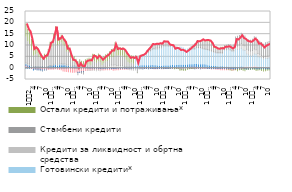
| Category | Минуси по трансакционим рачунима | Потрошачки кредити | Инвестициони кредити | Готовински кредити*  | Кредити за ликвидност и обртна средства | Стамбени кредити  | Oстали кредити и потраживања* |
|---|---|---|---|---|---|---|---|
| 1
2011. | 0.412 | 0.655 | 0.647 | 0 | 0.695 | 11.187 | 5.89 |
| 2 | 0.452 | 0.34 | 0.515 | 0 | 0.611 | 9.773 | 5.375 |
| 3 | 0.541 | 0.023 | 0.639 | 0 | 0.618 | 8.603 | 5.509 |
| 4 | 0.399 | -0.076 | 0.357 | 0 | 0.365 | 6.691 | 4.853 |
| 5 | 0.675 | -0.469 | -0.321 | 0 | 0.052 | 4.576 | 3.732 |
| 6 | 0.609 | -0.379 | -0.058 | 0 | -0.006 | 5.227 | 3.576 |
| 7 | 0.541 | -0.514 | -0.134 | 0 | -0.154 | 5.662 | 2.763 |
| 8 | 0.556 | -0.509 | -0.208 | 0 | -0.201 | 4.307 | 2.537 |
| 9 | 0.546 | -0.636 | -0.314 | 0 | -0.156 | 3.469 | 2.081 |
| 10 | 0.684 | -0.802 | -0.386 | 0 | -0.169 | 3.05 | 1.577 |
| 11 | 0.529 | -0.704 | -0.115 | 0 | -0.125 | 3.653 | 1.909 |
| 12 | 0.401 | -0.688 | -0.061 | 0 | -0.026 | 3.46 | 2.261 |
| 1 
2012. | 0.483 | -0.601 | 0.179 | 0 | 0.085 | 5.105 | 2.378 |
| 2 | 0.517 | -0.461 | 0.426 | 0 | 0.216 | 7.457 | 2.786 |
| 3 | 0.497 | -0.497 | 0.333 | 0 | 0.202 | 7.884 | 2.928 |
| 4 | 0.653 | -0.495 | 0.639 | 0 | 0.397 | 9.859 | 3.418 |
| 5 | 0.479 | -0.228 | 1.036 | 0 | 0.643 | 12.119 | 4.015 |
| 6 | 0.463 | -0.504 | 0.735 | 0 | 0.581 | 8.255 | 2.868 |
| 7 | 0.615 | -0.629 | 0.883 | 0 | 0.671 | 8.155 | 3.058 |
| 8 | 0.511 | -0.685 | 0.92 | 0 | 0.623 | 9.179 | 3.286 |
| 9 | 0.57 | -1.197 | 0.855 | 0 | 0.533 | 8.168 | 3.494 |
| 10 | 0.499 | -1.347 | 0.833 | 0 | 0.583 | 7.472 | 3.373 |
| 11 | 0.441 | -1.518 | 0.548 | 0 | 0.558 | 5.485 | 2.874 |
| 12 | 0.547 | -1.551 | 0.518 | 0 | 0.424 | 5.605 | 2.923 |
| 1 
2013. | 0.534 | -1.639 | 0.244 | 0 | 0.336 | 3.424 | 2.781 |
| 2 | 0.464 | -1.746 | 0.136 | 0 | 0.345 | 1.74 | 2.518 |
| 3 | 0.403 | -1.75 | 0.211 | 0 | 0.551 | 1.523 | 2.364 |
| 4 | 0.367 | -1.728 | 0.106 | 0 | 0.443 | 0.626 | 2.441 |
| 5 | 0.422 | -1.787 | -0.089 | 0 | 0.268 | -1.059 | 2.233 |
| 6 | 0.35 | -1.762 | -0.003 | 0 | 0.284 | 0.514 | 2.533 |
| 7 | 0.368 | -1.594 | -0.112 | 0 | 0.167 | -0.521 | 2.477 |
| 8 | 0.27 | -1.512 | -0.065 | 0 | 0.164 | -0.958 | 2.442 |
| 9 | 0.281 | -1.039 | 0.085 | 0 | 0.137 | 0.618 | 2.564 |
| 10 | 0.297 | -0.902 | 0.094 | 0 | -0.038 | 0.921 | 2.75 |
| 11 | 0.235 | -0.834 | 0.111 | 0 | -0.198 | 1.086 | 2.917 |
| 12 | 0.178 | -0.794 | 0.137 | 0 | -0.187 | 0.826 | 3.055 |
| 1 
2014. | 0.163 | -0.699 | 0.277 | 0 | -0.19 | 2.557 | 3.189 |
| 2 | 0.048 | -0.663 | 0.268 | 0 | -0.281 | 2.509 | 3.222 |
| 3 | 0.094 | -0.639 | 0.145 | 0 | -0.482 | 1.938 | 3.155 |
| 4 | 0.088 | -0.627 | 0.19 | 0 | -0.426 | 2.678 | 3.33 |
| 5 | -0.105 | -0.664 | 0.143 | 0 | -0.396 | 2.372 | 3.214 |
| 6 | 0.02 | -0.711 | 0.058 | 0 | -0.048 | 1.151 | 3.05 |
| 7 | -0.1 | -0.682 | 0.09 | 0 | 0.32 | 1.577 | 3.139 |
| 8 | -0.098 | -0.654 | 0.11 | 0 | 0.501 | 2.094 | 3.183 |
| 9 | -0.08 | -0.621 | 0.121 | 0 | 0.69 | 2.175 | 3.302 |
| 10 | -0.148 | -0.547 | 0.189 | 0 | 0.932 | 2.703 | 3.422 |
| 11 | -0.14 | -0.49 | 0.303 | 0 | 1.081 | 3.394 | 3.457 |
| 12 | -0.095 | -0.791 | 0.278 | 0 | 1.17 | 3.248 | 3.754 |
| 1 
2015. | -0.102 | -0.722 | 0.343 | 0 | 1.114 | 5.922 | 3.859 |
| 2 | 0.048 | -0.737 | 0.195 | 0 | 0.973 | 4.05 | 3.693 |
| 3 | 0.078 | -0.685 | 0.247 | 0 | 0.922 | 4.241 | 3.711 |
| 4 | 0.096 | -0.603 | 0.301 | 0 | 0.83 | 4.023 | 3.6 |
| 5 | 0.037 | -0.521 | 0.362 | 0 | 0.768 | 4.169 | 3.609 |
| 6 | 0.047 | -0.467 | 0.415 | 0 | 0.376 | 3.845 | 3.593 |
| 7 | 0.01 | -0.442 | 0.394 | 0 | 0.046 | 2.992 | 3.466 |
| 8 | 0.058 | -0.421 | 0.347 | 0 | -0.145 | 2.15 | 3.375 |
| 9 | -0.026 | -0.39 | 0.351 | 0 | -0.321 | 1.522 | 3.171 |
| 10 | -0.033 | -0.351 | 0.468 | 0 | -0.479 | 1.792 | 3.211 |
| 11 | 0.007 | -0.339 | 0.508 | 0 | -0.579 | 1.257 | 3.448 |
| 12 | -0.087 | -0.021 | 0.654 | 3.552 | -0.681 | 1.317 | 0.019 |
| 1 
2016. | -0.12 | -0.038 | 0.641 | 3.515 | -0.582 | -1.316 | -0.025 |
| 2 | -0.042 | 0.034 | 0.85 | 3.881 | -0.388 | 0.549 | 0.154 |
| 3 | -0.146 | 0.068 | 0.978 | 4.216 | -0.247 | 0.342 | 0.186 |
| 4 | -0.279 | 0.073 | 0.987 | 4.537 | -0.079 | 0.284 | 0.167 |
| 5 | -0.104 | 0.08 | 1.024 | 4.836 | 0.065 | 0.197 | 0.147 |
| 6 | -0.168 | 0.079 | 1.041 | 5.433 | 0.173 | 0.726 | 0.163 |
| 7 | -0.246 | 0.06 | 1.047 | 5.821 | 0.279 | 1.219 | 0.163 |
| 8 | -0.148 | 0.032 | 1.055 | 6.415 | 0.344 | 1.416 | 0.19 |
| 9 | -0.173 | 0.016 | 1.155 | 6.914 | 0.395 | 1.995 | 0.155 |
| 10 | -0.17 | -0.034 | 1.081 | 7.211 | 0.419 | 1.611 | 0.169 |
| 11 | -0.167 | -0.049 | 1.027 | 7.335 | 0.514 | 1.711 | 0.172 |
| 12 | -0.193 | -0.032 | 0.941 | 7.385 | 0.605 | 1.754 | 0.023 |
| 1 
2017. | -0.102 | -0.027 | 0.885 | 7.581 | 0.588 | 1.859 | -0.016 |
| 2 | -0.198 | -0.035 | 0.861 | 7.898 | 0.569 | 1.613 | -0.091 |
| 3 | -0.199 | -0.038 | 0.923 | 8.527 | 0.586 | 1.952 | -0.092 |
| 4 | -0.146 | -0.037 | 0.934 | 8.68 | 0.503 | 1.701 | -0.11 |
| 5 | -0.133 | -0.019 | 0.947 | 8.857 | 0.381 | 1.497 | 0.01 |
| 6 | -0.143 | -0.005 | 0.956 | 8.678 | 0.279 | 0.718 | -0.217 |
| 7 | -0.013 | 0.059 | 1.006 | 8.629 | 0.228 | 0.316 | -0.214 |
| 8 | -0.025 | 0.139 | 1.036 | 8.631 | 0.243 | 0.065 | -0.222 |
| 9 | -0.092 | 0.1 | 0.927 | 7.933 | 0.137 | -0.102 | -0.54 |
| 10 | -0.014 | 0.192 | 0.97 | 7.844 | 0.168 | 0.026 | -0.452 |
| 11 | -0.022 | 0.255 | 0.969 | 7.831 | -0.021 | 0.031 | -0.498 |
| 12 | -0.054 | 0.254 | 1.01 | 7.952 | 0.005 | -0.47 | -0.877 |
| 1 
2018. | -0.078 | 0.267 | 1.018 | 7.896 | -0.006 | -0.505 | -0.694 |
| 2 | -0.108 | 0.303 | 1.009 | 7.581 | -0.048 | -0.54 | -0.654 |
| 3 | -0.106 | 0.351 | 0.969 | 6.983 | -0.121 | -0.413 | -0.717 |
| 4 | -0.078 | 0.403 | 1.023 | 7.016 | -0.082 | -0.072 | -0.642 |
| 5 | -0.111 | 0.436 | 1.041 | 6.967 | 0.005 | 0.451 | -0.6 |
| 6 | -0.162 | 0.469 | 1.039 | 6.937 | 0.094 | 1.001 | -0.427 |
| 7 | -0.142 | 0.466 | 1.069 | 6.945 | 0.085 | 1.514 | -0.324 |
| 8 | -0.222 | 0.46 | 1.118 | 6.888 | 0.077 | 2.32 | -0.261 |
| 9 | -0.138 | 0.484 | 1.165 | 7.384 | 0.187 | 2.546 | 0.117 |
| 10 | -0.123 | 0.428 | 1.132 | 7.362 | 0.141 | 2.551 | 0.144 |
| 11 | -0.204 | 0.371 | 1.18 | 7.329 | 0.288 | 2.69 | 0.264 |
| 12 | -0.005 | 0.361 | 1.199 | 7.048 | 0.252 | 3.102 | 0.55 |
| 1 
2019. | -0.044 | 0.337 | 1.157 | 6.828 | 0.26 | 2.997 | 0.432 |
| 2 | -0.024 | 0.282 | 1.169 | 6.77 | 0.272 | 3.201 | 0.506 |
| 3 | -0.041 | -0.02 | 1.116 | 6.86 | 0.274 | 3.178 | 0.792 |
| 4 | -0.041 | -0.073 | 0.939 | 6.696 | 0.345 | 3.284 | 0.798 |
| 5 | -0.1 | -0.229 | 0.83 | 6.484 | 0.327 | 2.858 | 0.77 |
| 6 | -0.031 | -0.277 | 0.797 | 6.185 | 0.319 | 1.374 | 0.855 |
| 7 | -0.025 | -0.342 | 0.694 | 6.127 | 0.359 | 1.27 | 0.898 |
| 8 | -0.025 | -0.5 | 0.607 | 5.99 | 0.369 | 1.126 | 0.852 |
| 9 | 0.002 | -0.514 | 0.56 | 5.994 | 0.317 | 1.12 | 0.891 |
| 10 | -0.05 | -0.604 | 0.592 | 5.95 | 0.362 | 1.371 | 0.961 |
| 11 | 0.007 | -0.709 | 0.641 | 5.959 | 0.208 | 1.453 | 0.934 |
| 12 | -0.045 | -0.707 | 0.566 | 7.406 | 0.294 | 1.642 | 0.089 |
| 1 
2020. | -0.066 | -0.686 | 0.495 | 7.544 | 0.344 | 1.722 | -0.116 |
| 2 | -0.05 | -0.649 | 0.443 | 7.828 | 0.418 | 1.801 | -0.347 |
| 3 | -0.141 | -0.471 | 0.334 | 7.545 | 0.486 | 1.977 | -0.679 |
| 4 | -0.389 | -0.484 | 0.406 | 6.944 | 0.42 | 2.096 | -0.519 |
| 5 | -0.494 | -0.317 | 0.428 | 6.789 | 0.626 | 2.371 | -0.328 |
| 6 | -0.368 | -0.215 | 0.451 | 7.975 | 1.289 | 3.99 | -0.525 |
| 7 | -0.411 | -0.138 | 0.377 | 7.821 | 1.565 | 4.265 | -1.028 |
| 8 | -0.349 | 0.049 | 0.352 | 7.987 | 1.773 | 4.265 | -0.806 |
| 9 | -0.363 | 0.173 | 0.326 | 8.282 | 2.131 | 4.455 | -0.703 |
| 10 | -0.292 | 0.266 | 0.189 | 7.608 | 2.029 | 4.379 | -1.1 |
| 11 | -0.235 | 0.385 | -0.011 | 7.36 | 2.116 | 4.383 | -1.298 |
| 12 | -0.3 | 0.412 | -0.043 | 5.859 | 2.023 | 4.491 | -0.593 |
| 1 
2021. | -0.28 | 0.395 | -0.052 | 5.525 | 1.958 | 4.618 | -0.57 |
| 2 | -0.274 | 0.392 | -0.106 | 5.275 | 1.915 | 4.753 | -0.531 |
| 3 | -0.144 | 0.43 | -0.129 | 5.318 | 2.023 | 5.007 | -0.586 |
| 4 | 0.02 | 0.448 | -0.184 | 5.832 | 2.193 | 5.389 | -0.888 |
| 5 | 0.141 | 0.385 | -0.315 | 5.659 | 1.985 | 5.525 | -1.173 |
| 6 | 0.036 | 0.298 | -0.373 | 4.656 | 1.44 | 5.593 | -1.042 |
| 7 | 0.04 | 0.269 | -0.35 | 4.66 | 1.173 | 5.677 | -0.758 |
| 8 | 0.058 | 0.204 | -0.414 | 4.305 | 0.972 | 5.769 | -1.013 |
| 9 | 0 | 0.127 | -0.409 | 3.878 | 0.754 | 5.803 | -1.233 |
| 10 | -0.106 | 0.11 | -0.329 | 4.22 | 0.862 | 6.006 | -1.094 |
| 11 | -0.108 | 0.092 | -0.264 | 4.21 | 0.984 | 6.126 | -0.962 |
| 12 | -0.086 | 0.08 | -0.27 | 4.362 | 1.038 | 6.288 | -0.855 |